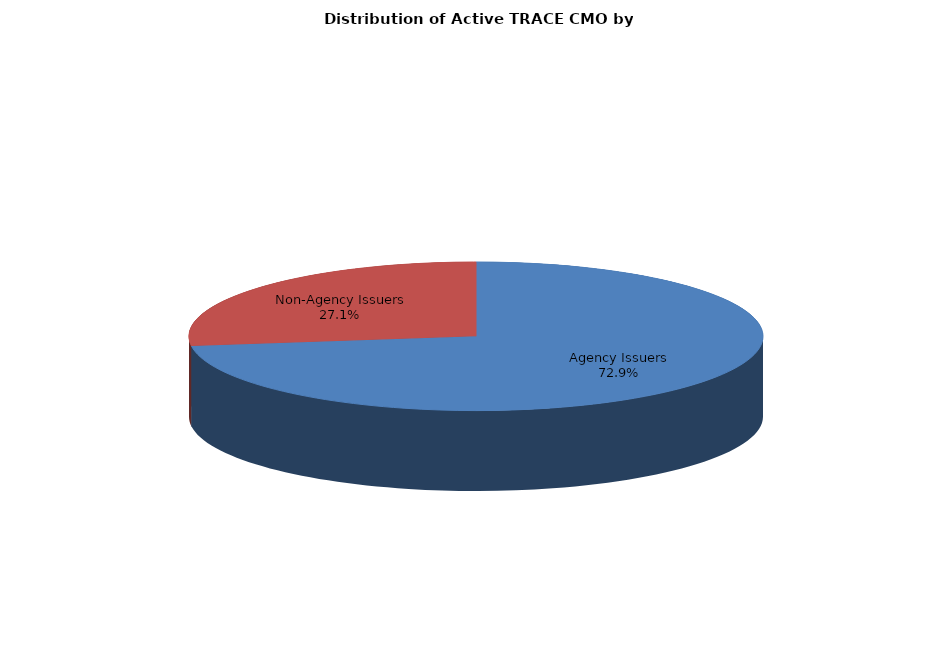
| Category | Series 0 |
|---|---|
| Agency Issuers | 206535 |
| Non-Agency Issuers | 76818 |